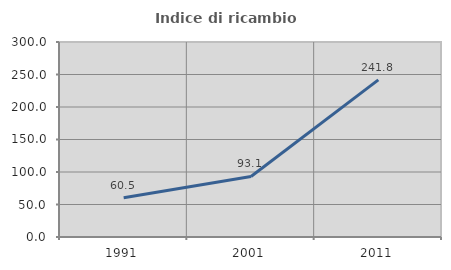
| Category | Indice di ricambio occupazionale  |
|---|---|
| 1991.0 | 60.526 |
| 2001.0 | 93.092 |
| 2011.0 | 241.81 |